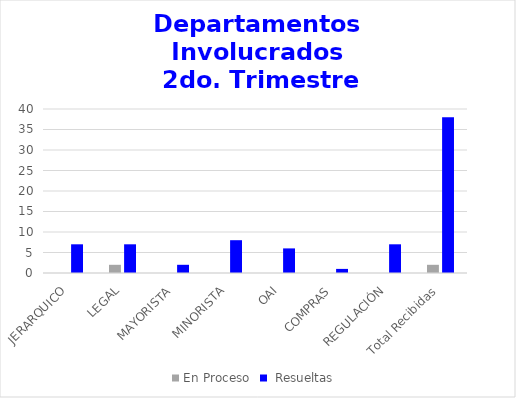
| Category | En Proceso |  Resueltas  |
|---|---|---|
| JERARQUICO | 0 | 7 |
| LEGAL | 2 | 7 |
| MAYORISTA | 0 | 2 |
| MINORISTA | 0 | 8 |
| OAI | 0 | 6 |
| COMPRAS | 0 | 1 |
| REGULACIÓN | 0 | 7 |
| Total Recibidas | 2 | 38 |